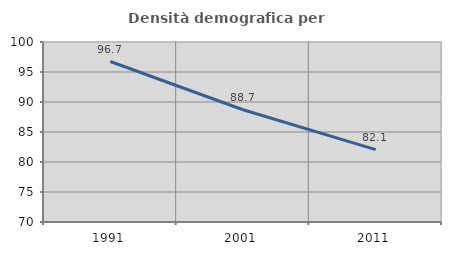
| Category | Densità demografica |
|---|---|
| 1991.0 | 96.749 |
| 2001.0 | 88.71 |
| 2011.0 | 82.054 |